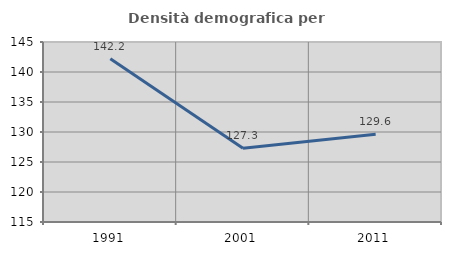
| Category | Densità demografica |
|---|---|
| 1991.0 | 142.21 |
| 2001.0 | 127.296 |
| 2011.0 | 129.619 |